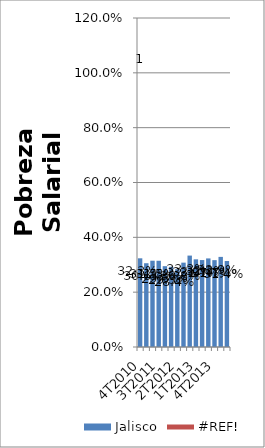
| Category | Jalisco |
|---|---|
| 4T2010 | 0.323 |
| 1T2011 | 0.306 |
| 2T2011 | 0.315 |
| 3T2011 | 0.315 |
| 4T2011 | 0.295 |
| 1T2012 | 0.293 |
| 2T2012 | 0.284 |
| 3T2012 | 0.308 |
| 4T2012 | 0.333 |
| 1T2013 | 0.32 |
| 2T2013 | 0.317 |
| 3T2013 | 0.323 |
| 4T2013 | 0.317 |
| 1T2014 | 0.329 |
| 2T2014 | 0.314 |